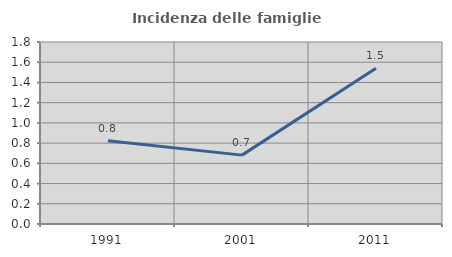
| Category | Incidenza delle famiglie numerose |
|---|---|
| 1991.0 | 0.822 |
| 2001.0 | 0.681 |
| 2011.0 | 1.54 |